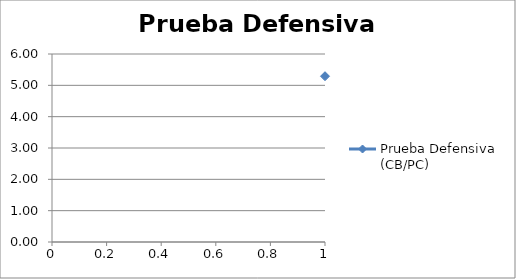
| Category | Prueba Defensiva (CB/PC) |
|---|---|
| 0 | 5.291 |
| 1 | 5.301 |
| 2 | 4.557 |
| 3 | 4.518 |
| 4 | 5.208 |
| 5 | 5.154 |
| 6 | 4.45 |
| 7 | 0.695 |